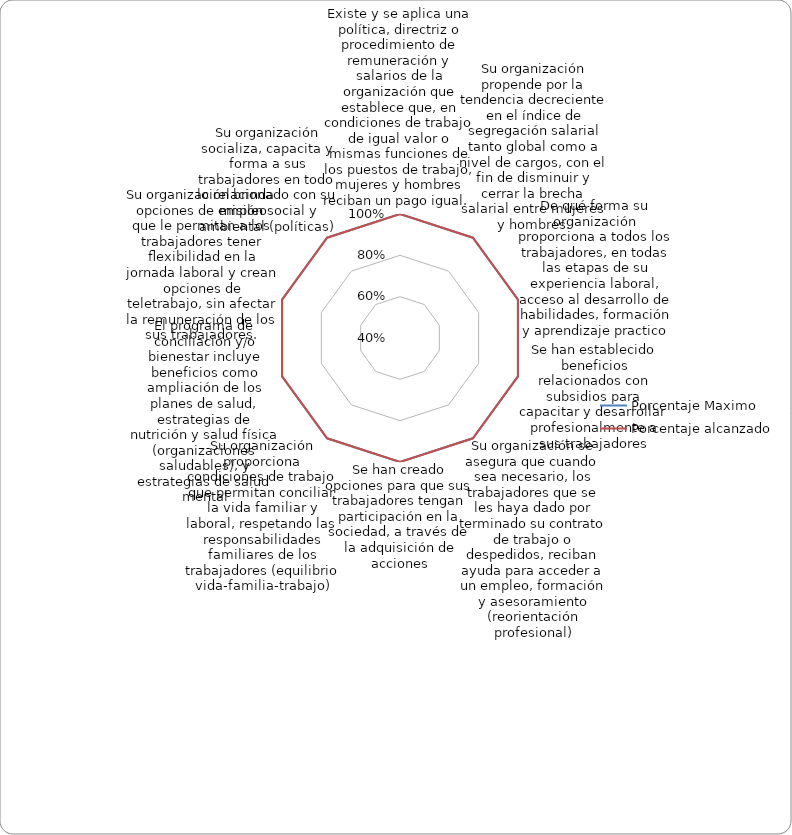
| Category | Porcentaje Maximo | Porcentaje alcanzado |
|---|---|---|
| Existe y se aplica una política, directriz o procedimiento de remuneración y salarios de la organización que establece que, en condiciones de trabajo de igual valor o mismas funciones de los puestos de trabajo, mujeres y hombres reciban un pago igual.  | 1 | 1 |
| Su organización propende por la tendencia decreciente en el índice de segregación salarial tanto global como a nivel de cargos, con el fin de disminuir y cerrar la brecha salarial entre mujeres y hombres. | 1 | 1 |
| De qué forma su organización proporciona a todos los trabajadores, en todas las etapas de su experiencia laboral, acceso al desarrollo de habilidades, formación y aprendizaje practico | 1 | 1 |
| Se han establecido beneficios relacionados con subsidios para capacitar y desarrollar profesionalmente a sus trabajadores | 1 | 1 |
| Su organización se asegura que cuando sea necesario, los trabajadores que se les haya dado por terminado su contrato de trabajo o despedidos, reciban ayuda para acceder a un empleo, formación y asesoramiento (reorientación profesional) | 1 | 1 |
| Se han creado opciones para que sus trabajadores tengan participación en la sociedad, a través de la adquisición de acciones | 1 | 1 |
| Su organización proporciona condiciones de trabajo que permitan conciliar la vida familiar y laboral, respetando las responsabilidades familiares de los trabajadores (equilibrio vida-familia-trabajo) | 1 | 1 |
| El programa de conciliación y/o bienestar incluye beneficios como ampliación de los planes de salud, estrategias de nutrición y salud física (organizaciones saludables), y estrategias de salud mental | 1 | 1 |
| Su organización brinda opciones de empleo que le permitan a los trabajadores tener ﬂexibilidad en la jornada laboral y crean opciones de teletrabajo, sin afectar la remuneración de los sus trabajadores. | 1 | 1 |
| Su organización socializa, capacita y forma a sus trabajadores en todo lo relacionado con su misión social y ambiental (políticas) | 1 | 1 |